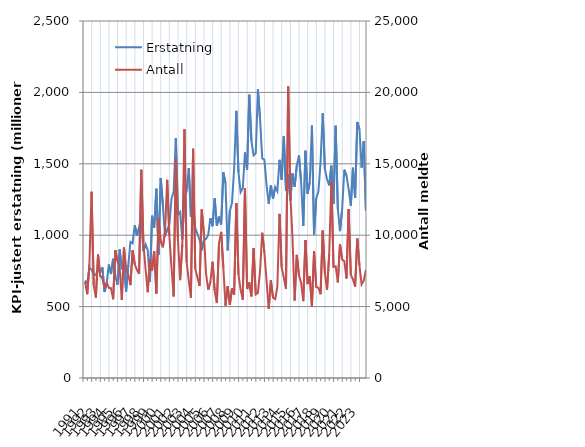
| Category | Erstatning |
|---|---|
| 1991.0 | 682.861 |
| nan | 660.593 |
| nan | 770.781 |
| nan | 757.68 |
| 1992.0 | 724.967 |
| nan | 720.337 |
| nan | 769.124 |
| nan | 738.283 |
| 1993.0 | 775.228 |
| nan | 602.058 |
| nan | 664.256 |
| nan | 794.965 |
| 1994.0 | 727.895 |
| nan | 835.014 |
| nan | 715.669 |
| nan | 653.422 |
| 1995.0 | 900.586 |
| nan | 761.203 |
| nan | 803.181 |
| nan | 605.711 |
| 1996.0 | 789.173 |
| nan | 953.39 |
| nan | 943.881 |
| nan | 1071.001 |
| 1997.0 | 996.152 |
| nan | 1053.434 |
| nan | 1142.066 |
| nan | 887.884 |
| 1998.0 | 935.373 |
| nan | 896.35 |
| nan | 671.783 |
| nan | 1136.193 |
| 1999.0 | 1052.729 |
| nan | 1325.657 |
| nan | 863.644 |
| nan | 1400.154 |
| 2000.0 | 1214.232 |
| nan | 993.707 |
| nan | 1038.895 |
| nan | 1072.169 |
| 2001.0 | 1253.265 |
| nan | 1304.559 |
| nan | 1679.765 |
| nan | 1144.776 |
| 2002.0 | 1162.727 |
| nan | 970.425 |
| nan | 1266.256 |
| nan | 1309.736 |
| 2003.0 | 1469.594 |
| nan | 1128.08 |
| nan | 1190.808 |
| nan | 1048.721 |
| 2004.0 | 1011.439 |
| nan | 967.557 |
| nan | 894.762 |
| nan | 963.959 |
| 2005.0 | 974.405 |
| nan | 1002.461 |
| nan | 1119.883 |
| nan | 1062.719 |
| 2006.0 | 1258.391 |
| nan | 1065.827 |
| nan | 1130.31 |
| nan | 1075.24 |
| 2007.0 | 1439.915 |
| nan | 1364.05 |
| nan | 893.677 |
| nan | 1169.116 |
| 2008.0 | 1224.519 |
| nan | 1465.019 |
| nan | 1870.593 |
| nan | 1441 |
| 2009.0 | 1301.099 |
| nan | 1328.36 |
| nan | 1578.846 |
| nan | 1458.773 |
| 2010.0 | 1984.188 |
| nan | 1660.479 |
| nan | 1559.014 |
| nan | 1574.052 |
| 2011.0 | 2021.055 |
| nan | 1813.246 |
| nan | 1538.78 |
| nan | 1527.545 |
| 2012.0 | 1353.017 |
| nan | 1220.672 |
| nan | 1348.959 |
| nan | 1256.877 |
| 2013.0 | 1337.311 |
| nan | 1307.667 |
| nan | 1527.592 |
| nan | 1388.401 |
| 2014.0 | 1693.847 |
| nan | 1313.108 |
| nan | 1424.554 |
| nan | 1243.361 |
| 2015.0 | 1432.487 |
| nan | 1339.063 |
| nan | 1487.095 |
| nan | 1558.19 |
| 2016.0 | 1375.58 |
| nan | 1064.405 |
| nan | 1591.137 |
| nan | 1290.489 |
| 2017.0 | 1371.785 |
| nan | 1767.479 |
| nan | 1003.271 |
| nan | 1257.841 |
| 2018.0 | 1305.9 |
| nan | 1512.06 |
| nan | 1853.654 |
| nan | 1464.441 |
| 2019.0 | 1391.758 |
| nan | 1349.421 |
| nan | 1486.971 |
| nan | 1218.36 |
| 2020.0 | 1766.411 |
| nan | 1183.175 |
| nan | 1028.68 |
| nan | 1183.099 |
| 2021.0 | 1458.431 |
| nan | 1419.051 |
| nan | 1321.794 |
| nan | 1207.092 |
| 2022.0 | 1472.703 |
| nan | 1260.294 |
| nan | 1793.257 |
| nan | 1743.276 |
| 2023.0 | 1473.003 |
| nan | 1659.634 |
| nan | 1170.306 |